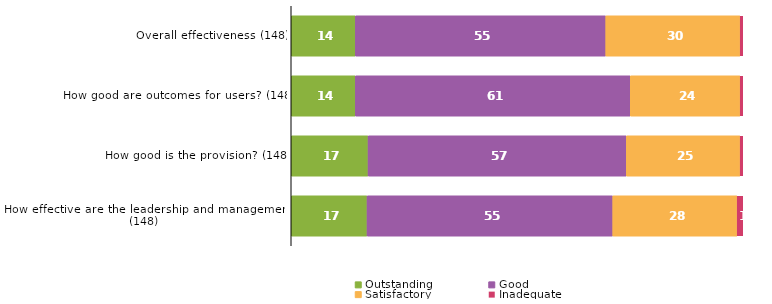
| Category | Outstanding | Good | Satisfactory | Inadequate |
|---|---|---|---|---|
| Overall effectiveness (148) | 14.189 | 55.405 | 29.73 | 0.676 |
| How good are outcomes for users? (148) | 14.189 | 60.811 | 24.324 | 0.676 |
| How good is the provision? (148) | 16.892 | 56.757 | 25 | 0.676 |
| How effective are the leadership and management? (148) | 16.892 | 54.73 | 27.703 | 1.351 |